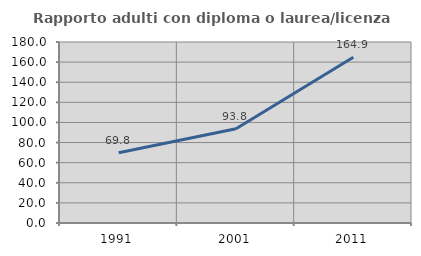
| Category | Rapporto adulti con diploma o laurea/licenza media  |
|---|---|
| 1991.0 | 69.841 |
| 2001.0 | 93.75 |
| 2011.0 | 164.925 |